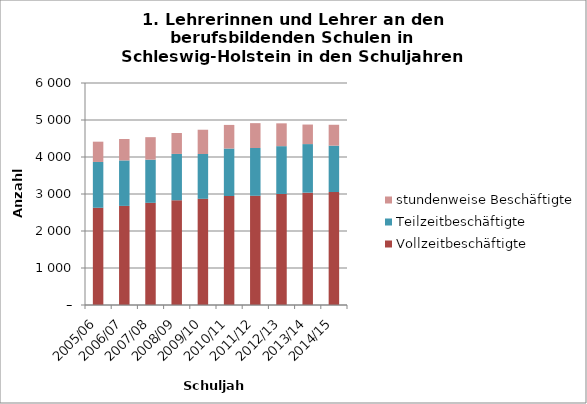
| Category | Vollzeitbeschäftigte | Teilzeitbeschäftigte | stundenweise Beschäftigte |
|---|---|---|---|
| 2005/06 | 2628 | 1238 | 548 |
| 2006/07 | 2678 | 1230 | 578 |
| 2007/08 | 2762 | 1166 | 608 |
| 2008/09 | 2831 | 1252 | 565 |
| 2009/10 | 2870 | 1211 | 656 |
| 2010/11 | 2946 | 1283 | 638 |
| 2011/12 | 2952 | 1291 | 672 |
| 2012/13 | 3001 | 1292 | 617 |
| 2013/14 | 3036 | 1313 | 528 |
| 2014/15 | 3053 | 1254 | 564 |